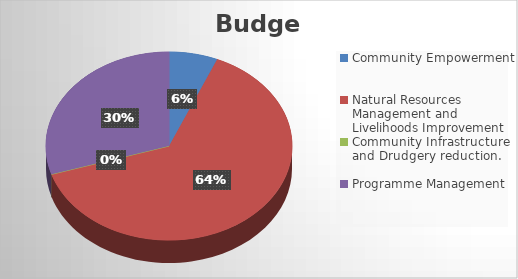
| Category | Budget |
|---|---|
| Community Empowerment | 22056000 |
| Natural Resources Management and Livelihoods Improvement | 220019100.935 |
| Community Infrastructure and Drudgery reduction. | 0 |
| Programme Management | 103045866.667 |